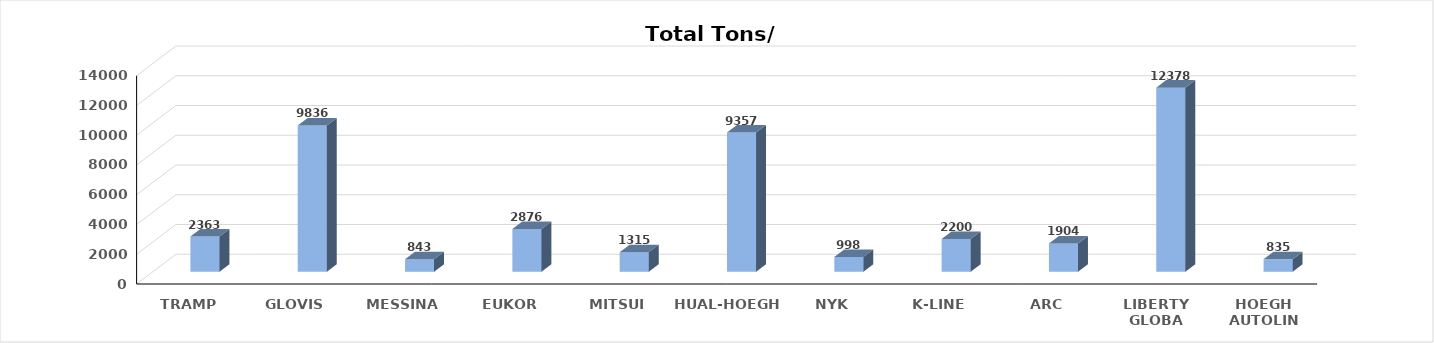
| Category | Series 0 |
|---|---|
| TRAMP | 2363 |
| GLOVIS | 9836 |
| MESSINA | 843 |
| EUKOR | 2876 |
| MITSUI | 1315 |
| HUAL-HOEGH | 9357 |
| NYK | 998 |
| K-LINE | 2200 |
| ARC | 1904 |
| LIBERTY GLOBA | 12378 |
| HOEGH AUTOLIN | 835 |